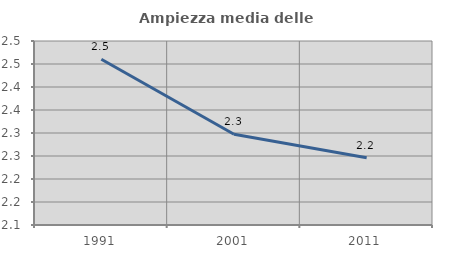
| Category | Ampiezza media delle famiglie |
|---|---|
| 1991.0 | 2.46 |
| 2001.0 | 2.297 |
| 2011.0 | 2.246 |